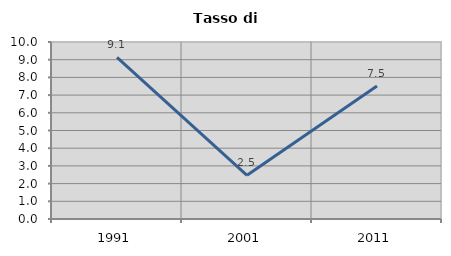
| Category | Tasso di disoccupazione   |
|---|---|
| 1991.0 | 9.125 |
| 2001.0 | 2.469 |
| 2011.0 | 7.509 |